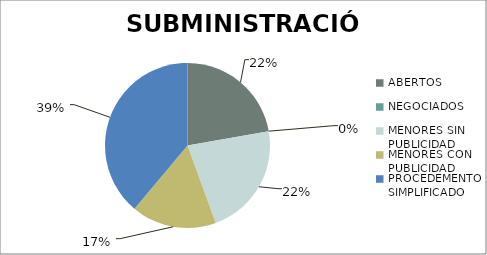
| Category | Series 0 |
|---|---|
| ABERTOS  | 4 |
| NEGOCIADOS  | 0 |
| MENORES SIN PUBLICIDAD | 4 |
| MENORES CON PUBLICIDAD | 3 |
| PROCEDEMENTO SIMPLIFICADO | 7 |